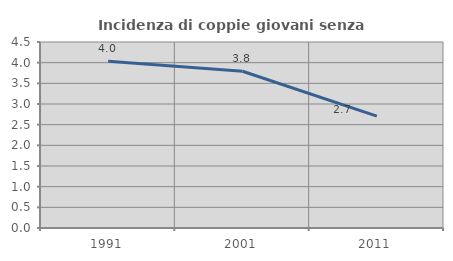
| Category | Incidenza di coppie giovani senza figli |
|---|---|
| 1991.0 | 4.031 |
| 2001.0 | 3.792 |
| 2011.0 | 2.708 |